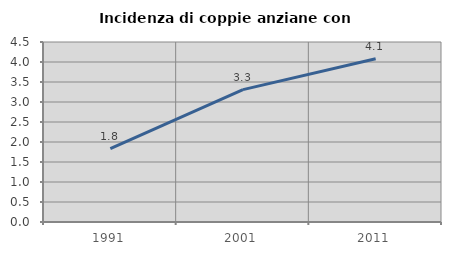
| Category | Incidenza di coppie anziane con figli |
|---|---|
| 1991.0 | 1.833 |
| 2001.0 | 3.309 |
| 2011.0 | 4.08 |